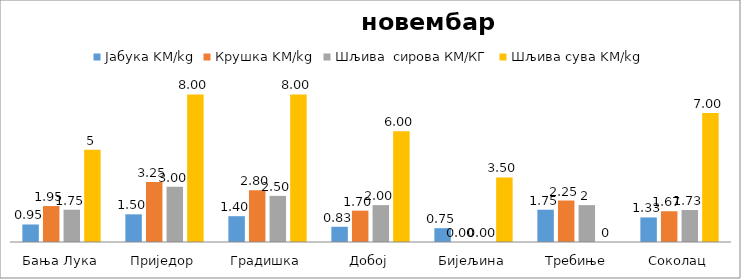
| Category | Јабука KM/kg | Крушка KM/kg | Шљива  сирова КМ/КГ | Шљива сува KM/kg |
|---|---|---|---|---|
| Бања Лука | 0.95 | 1.95 | 1.75 | 5 |
| Приједор | 1.5 | 3.25 | 3 | 8 |
| Градишка | 1.4 | 2.8 | 2.5 | 8 |
| Добој | 0.825 | 1.7 | 2 | 6 |
| Бијељина | 0.75 | 0 | 0 | 3.5 |
|  Требиње | 1.75 | 2.25 | 2 | 0 |
| Соколац | 1.333 | 1.667 | 1.733 | 7 |